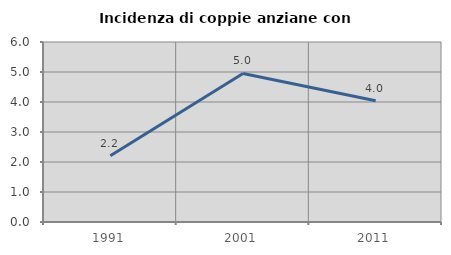
| Category | Incidenza di coppie anziane con figli |
|---|---|
| 1991.0 | 2.208 |
| 2001.0 | 4.953 |
| 2011.0 | 4.04 |